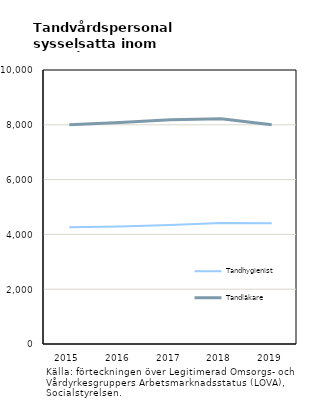
| Category | Tandhygienist | Tandläkare |
|---|---|---|
| 2015.0 | 4264 | 8005 |
| 2016.0 | 4285 | 8087 |
| 2017.0 | 4345 | 8183 |
| 2018.0 | 4415 | 8218 |
| 2019.0 | 4406 | 8003 |